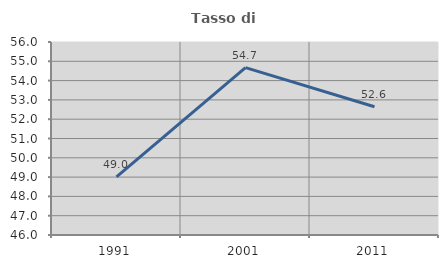
| Category | Tasso di occupazione   |
|---|---|
| 1991.0 | 49.009 |
| 2001.0 | 54.671 |
| 2011.0 | 52.642 |